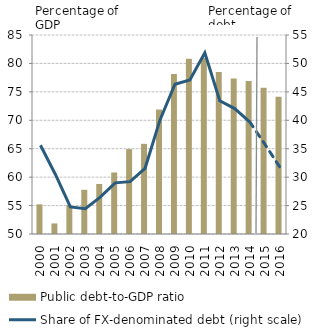
| Category | Public debt-to-GDP ratio |
|---|---|
| 2000.0 | 55.21 |
| 2001.0 | 51.858 |
| 2002.0 | 55.113 |
| 2003.0 | 57.777 |
| 2004.0 | 58.792 |
| 2005.0 | 60.823 |
| 2006.0 | 64.928 |
| 2007.0 | 65.858 |
| 2008.0 | 71.891 |
| 2009.0 | 78.127 |
| 2010.0 | 80.838 |
| 2011.0 | 80.963 |
| 2012.0 | 78.492 |
| 2013.0 | 77.336 |
| 2014.0 | 76.892 |
| 2015.0 | 75.705 |
| 2016.0 | 74.119 |